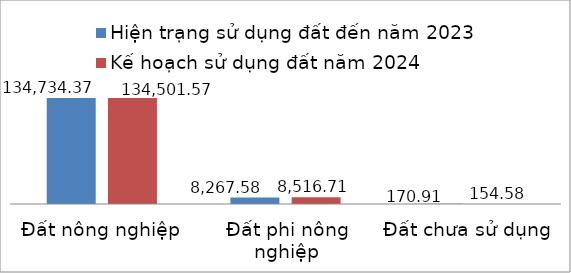
| Category | Hiện trạng sử dụng đất đến năm 2023 | Kế hoạch sử dụng đất năm 2024 |
|---|---|---|
| Đất nông nghiệp | 134734.37 | 134501.57 |
| Đất phi nông nghiệp | 8267.58 | 8516.71 |
| Đất chưa sử dụng | 170.91 | 154.58 |